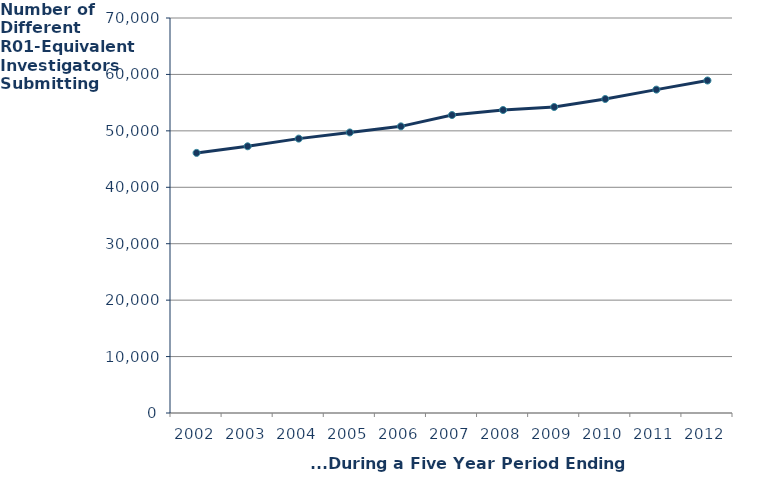
| Category | PIs |
|---|---|
| 2002.0 | 46093 |
| 2003.0 | 47265 |
| 2004.0 | 48624 |
| 2005.0 | 49718 |
| 2006.0 | 50798 |
| 2007.0 | 52801 |
| 2008.0 | 53693 |
| 2009.0 | 54229 |
| 2010.0 | 55646 |
| 2011.0 | 57308 |
| 2012.0 | 58922 |